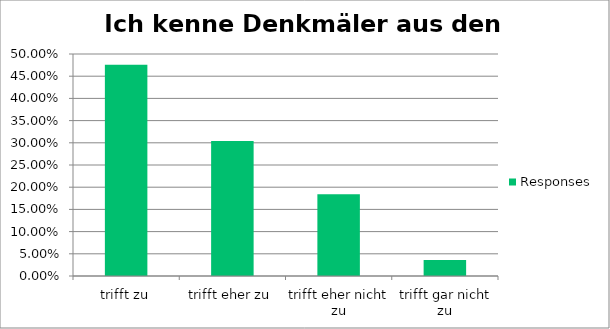
| Category | Responses |
|---|---|
| trifft zu | 0.476 |
| trifft eher zu | 0.304 |
| trifft eher nicht zu | 0.184 |
| trifft gar nicht zu | 0.036 |